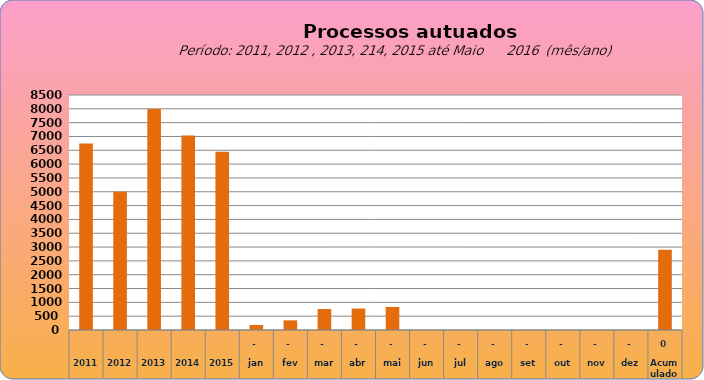
| Category | 6749 |
|---|---|
| 2011 | 6749 |
| 2012 | 4997 |
| 2013 | 7990 |
| 2014 | 7034 |
| 2015 | 6446 |
| jan | 182 |
| fev | 349 |
| mar | 760 |
| abr | 777 |
| mai | 834 |
| jun | 0 |
| jul | 0 |
| ago | 0 |
| set | 0 |
| out | 0 |
| nov | 0 |
| dez | 0 |
| Acumulado
 | 2902 |